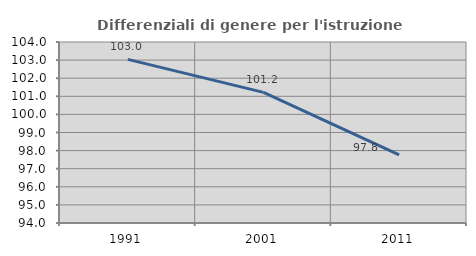
| Category | Differenziali di genere per l'istruzione superiore |
|---|---|
| 1991.0 | 103.038 |
| 2001.0 | 101.217 |
| 2011.0 | 97.768 |